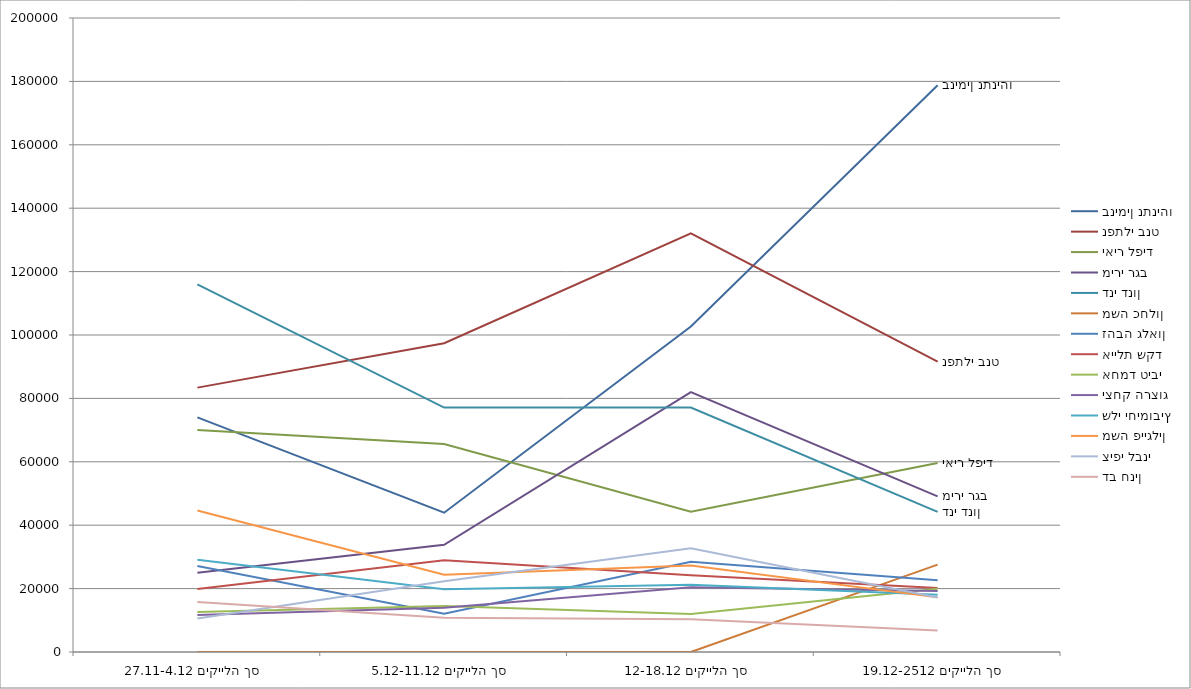
| Category | בנימין נתניהו | נפתלי בנט | יאיר לפיד | מירי רגב | דני דנון | משה כחלון | זהבה גלאון | איילת שקד | אחמד טיבי | יצחק הרצוג | שלי יחימוביץ | משה פייגלין | ציפי לבני | דב חנין |
|---|---|---|---|---|---|---|---|---|---|---|---|---|---|---|
| סך הלייקים 27.11-4.12 | 74031 | 83399 | 70018 | 24976 | 115992 | 0 | 27110 | 19846 | 12591 | 11641 | 29113 | 44650 | 10556 | 15748 |
| סך הלייקים 5.12-11.12 | 43950 | 97411 | 65628 | 33802 | 77100 | 0 | 12038 | 28910 | 14492 | 13976 | 19766 | 24371 | 22328 | 10807 |
| סך הלייקים 12-18.12 | 102660 | 132073 | 44264 | 82007 | 77133 | 0 | 28498 | 24238 | 11989 | 20387 | 21200 | 27315 | 32727 | 10329 |
| סך הלייקים 19.12-2512 | 178796 | 91568 | 59642 | 49097 | 44183 | 27549 | 22628 | 20193 | 19923 | 19238 | 18037 | 17232 | 17172 | 6772 |